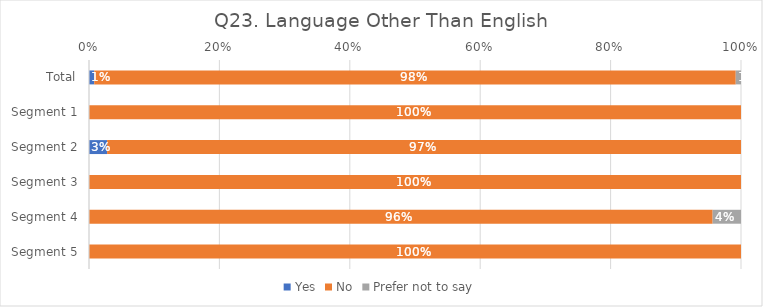
| Category | Yes | No | Prefer not to say |
|---|---|---|---|
| Total | 0.008 | 0.984 | 0.008 |
| Segment 1 | 0 | 1 | 0 |
| Segment 2 | 0.028 | 0.972 | 0 |
| Segment 3 | 0 | 1 | 0 |
| Segment 4 | 0 | 0.957 | 0.043 |
| Segment 5 | 0 | 1 | 0 |